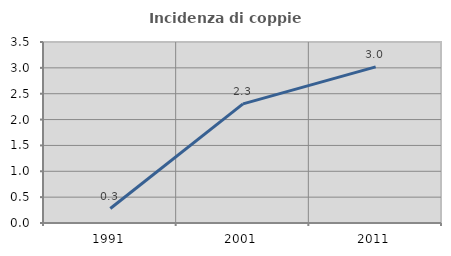
| Category | Incidenza di coppie miste |
|---|---|
| 1991.0 | 0.28 |
| 2001.0 | 2.304 |
| 2011.0 | 3.019 |